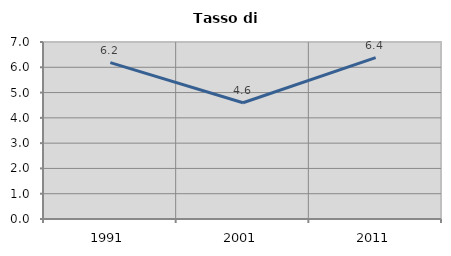
| Category | Tasso di disoccupazione   |
|---|---|
| 1991.0 | 6.185 |
| 2001.0 | 4.596 |
| 2011.0 | 6.381 |